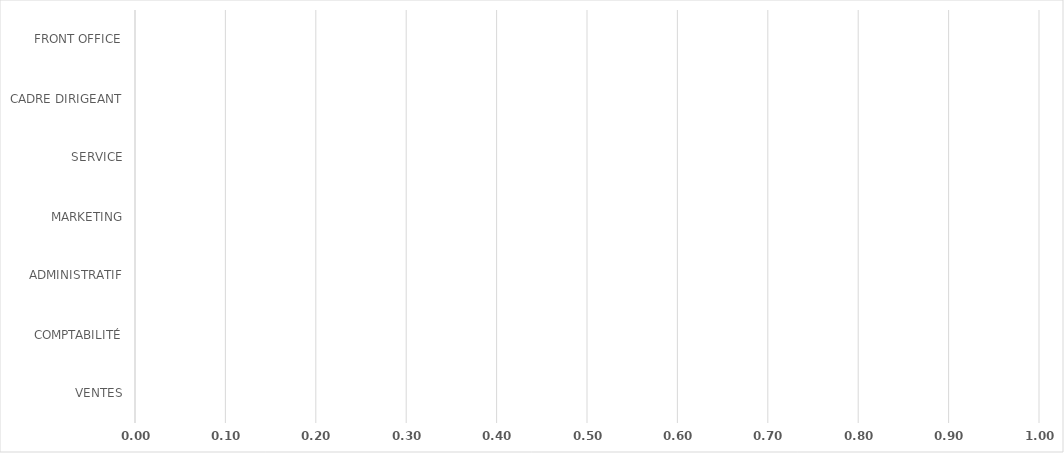
| Category | Series 0 |
|---|---|
| VENTES | 0 |
| COMPTABILITÉ | 0 |
| ADMINISTRATIF | 0 |
| MARKETING | 0 |
| SERVICE | 0 |
| CADRE DIRIGEANT | 0 |
| FRONT OFFICE | 0 |